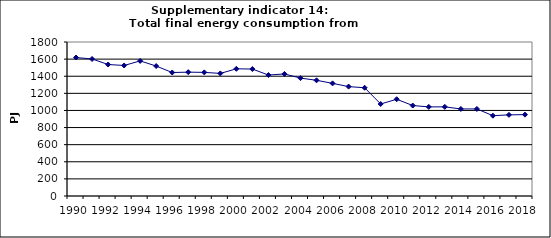
| Category | Total final energy consumption from industry, PJ |
|---|---|
| 1990 | 1618.6 |
| 1991 | 1601.732 |
| 1992 | 1536.999 |
| 1993 | 1525.662 |
| 1994 | 1578.897 |
| 1995 | 1518.823 |
| 1996 | 1443.198 |
| 1997 | 1447.69 |
| 1998 | 1444.955 |
| 1999 | 1432.801 |
| 2000 | 1486.572 |
| 2001 | 1483.912 |
| 2002 | 1413.626 |
| 2003 | 1426.618 |
| 2004 | 1377.978 |
| 2005 | 1352.47 |
| 2006 | 1316.422 |
| 2007 | 1278.661 |
| 2008 | 1265.234 |
| 2009 | 1075.475 |
| 2010 | 1130.888 |
| 2011 | 1057.346 |
| 2012 | 1041.494 |
| 2013 | 1042.066 |
| 2014 | 1017.474 |
| 2015 | 1017.619 |
| 2016 | 938.568 |
| 2017 | 948.547 |
| 2018 | 951.054 |